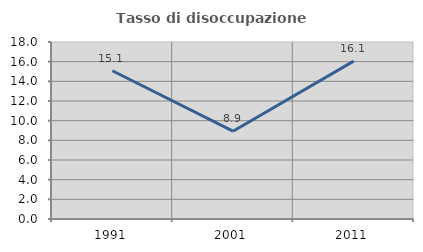
| Category | Tasso di disoccupazione giovanile  |
|---|---|
| 1991.0 | 15.074 |
| 2001.0 | 8.929 |
| 2011.0 | 16.055 |